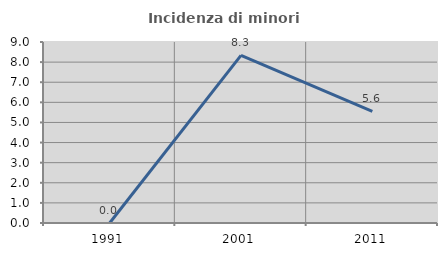
| Category | Incidenza di minori stranieri |
|---|---|
| 1991.0 | 0 |
| 2001.0 | 8.333 |
| 2011.0 | 5.556 |